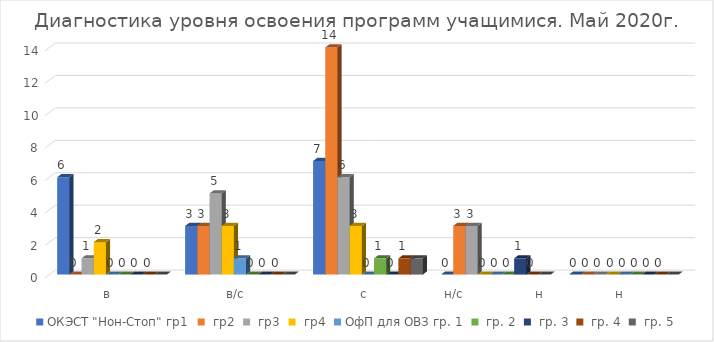
| Category | ОКЭСТ "Нон-Стоп" | ОфП для ОВЗ |
|---|---|---|
| в | 2 | 0 |
| в/с | 3 | 0 |
| с | 3 | 1 |
| н/с                  н | 0 | 0 |
| н | 0 | 0 |